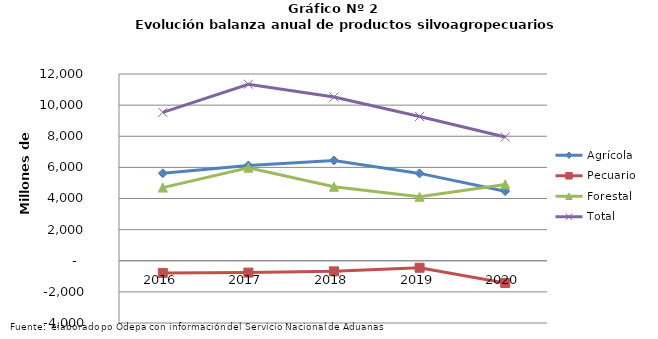
| Category | Agrícola | Pecuario | Forestal | Total |
|---|---|---|---|---|
| 2016.0 | 5619304 | -782654 | 4700192 | 9536842 |
| 2017.0 | 6126434 | -761998 | 5976134 | 11340570 |
| 2018.0 | 6446329 | -681646 | 4755333 | 10520016 |
| 2019.0 | 5613120 | -450171 | 4105622 | 9268571 |
| 2020.0 | 4471843 | -1425069 | 4905958 | 7952732 |